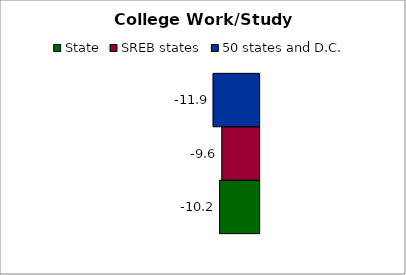
| Category | State | SREB states | 50 states and D.C. |
|---|---|---|---|
| 0 | -10.207 | -9.609 | -11.865 |